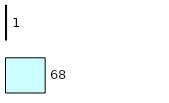
| Category | Series 0 | Series 1 |
|---|---|---|
| 0 | 68 | 1 |